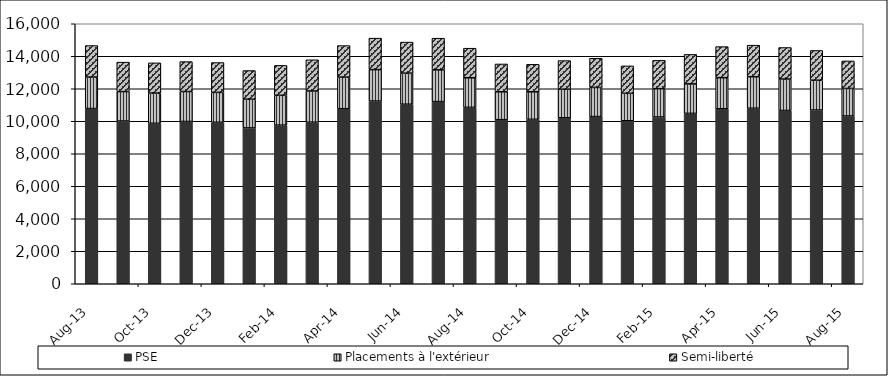
| Category | PSE | Placements à l'extérieur | Semi-liberté |
|---|---|---|---|
| 2013-08-01 | 10782 | 1939 | 1939 |
| 2013-09-01 | 10013 | 1813 | 1813 |
| 2013-10-01 | 9874 | 1860 | 1860 |
| 2013-11-01 | 9987 | 1842 | 1842 |
| 2013-12-01 | 9938 | 1838 | 1838 |
| 2014-01-01 | 9591 | 1765 | 1765 |
| 2014-02-01 | 9760 | 1838 | 1838 |
| 2014-03-01 | 9943 | 1920 | 1920 |
| 2014-04-01 | 10773 | 1942 | 1942 |
| 2014-05-01 | 11241 | 1937 | 1937 |
| 2014-06-01 | 11048 | 1912 | 1912 |
| 2014-07-01 | 11210 | 1951 | 1951 |
| 2014-08-01 | 10856 | 1820 | 1820 |
| 2014-09-01 | 10098 | 1714 | 1714 |
| 2014-10-01 | 10120 | 1692 | 1692 |
| 2014-11-01 | 10213 | 1760 | 1760 |
| 2014-12-01 | 10287 | 1794 | 1794 |
| 2015-01-01 | 10030 | 1689 | 1689 |
| 2015-02-01 | 10261 | 1743 | 1743 |
| 2015-03-01 | 10485 | 1814 | 1814 |
| 2015-04-01 | 10770 | 1912 | 1912 |
| 2015-05-01 | 10801 | 1941 | 1941 |
| 2015-06-01 | 10662 | 1938 | 1938 |
| 2015-07-01 | 10692 | 1832 | 1832 |
| 2015-08-01 | 10325 | 1694 | 1694 |